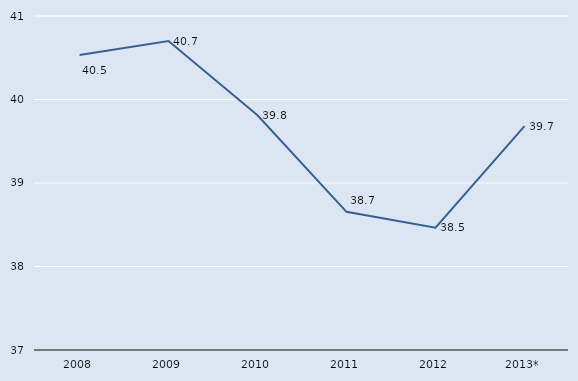
| Category | Series 0 |
|---|---|
| 2008 | 40.534 |
| 2009 | 40.701 |
| 2010 | 39.812 |
| 2011 | 38.655 |
| 2012 | 38.465 |
| 2013* | 39.681 |